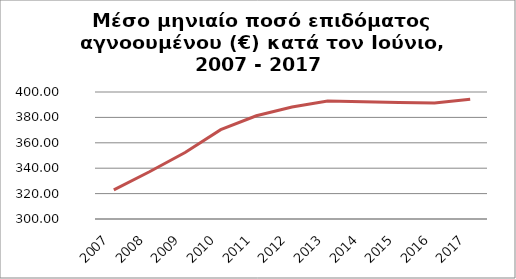
| Category | Series 1 |
|---|---|
| 2007.0 | 322.993 |
| 2008.0 | 337.19 |
| 2009.0 | 352.397 |
| 2010.0 | 370.359 |
| 2011.0 | 381.273 |
| 2012.0 | 388.193 |
| 2013.0 | 392.864 |
| 2014.0 | 392.227 |
| 2015.0 | 391.668 |
| 2016.0 | 391.32 |
| 2017.0 | 394.38 |